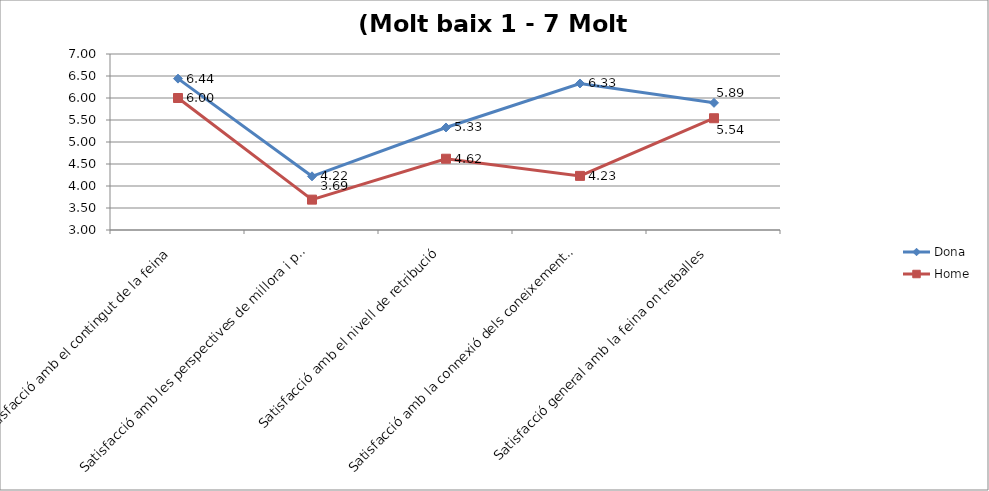
| Category | Dona | Home |
|---|---|---|
| Satisfacció amb el contingut de la feina | 6.44 | 6 |
| Satisfacció amb les perspectives de millora i promoció | 4.22 | 3.69 |
| Satisfacció amb el nivell de retribució | 5.33 | 4.62 |
| Satisfacció amb la connexió dels coneixements/competències desenvolupades de la formació doctoral i la feina | 6.33 | 4.23 |
| Satisfacció general amb la feina on treballes | 5.89 | 5.54 |